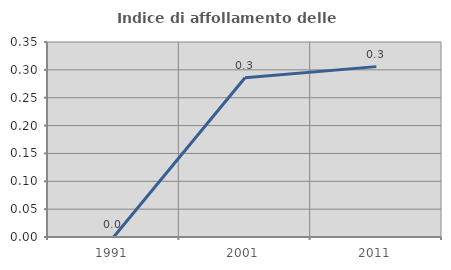
| Category | Indice di affollamento delle abitazioni  |
|---|---|
| 1991.0 | 0 |
| 2001.0 | 0.286 |
| 2011.0 | 0.306 |